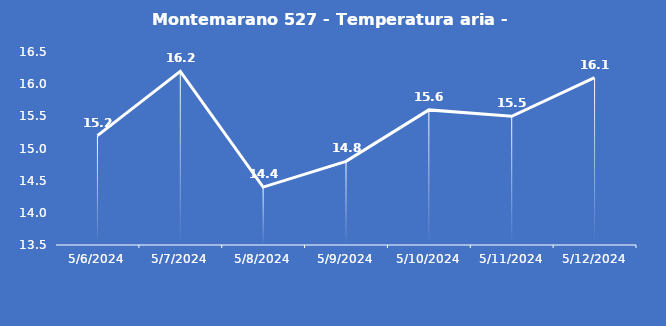
| Category | Montemarano 527 - Temperatura aria - Grezzo (°C) |
|---|---|
| 5/6/24 | 15.2 |
| 5/7/24 | 16.2 |
| 5/8/24 | 14.4 |
| 5/9/24 | 14.8 |
| 5/10/24 | 15.6 |
| 5/11/24 | 15.5 |
| 5/12/24 | 16.1 |